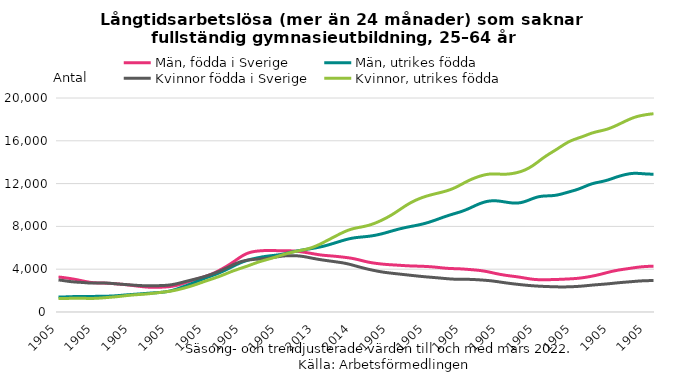
| Category | Män, födda i Sverige | Män, utrikes födda | Kvinnor födda i Sverige | Kvinnor, utrikes födda |
|---|---|---|---|---|
| 2006 | 3267.152 | 1395.05 | 2998.979 | 1259.358 |
| 2006-02 | 3238.533 | 1401.721 | 2961.518 | 1262.43 |
| 2006-03 | 3202.099 | 1409.549 | 2918.744 | 1265.991 |
| 2006-04 | 3160.918 | 1419.148 | 2876.447 | 1270.606 |
| 2006-05 | 3116.667 | 1430.543 | 2839.664 | 1276.511 |
| 2006-06 | 3068.672 | 1442.481 | 2811.801 | 1282.691 |
| 2006-07 | 3015.595 | 1452.34 | 2791.806 | 1286.376 |
| 2006-08 | 2956.97 | 1458.276 | 2775.028 | 1285.47 |
| 2006-09 | 2895.355 | 1460.155 | 2755.404 | 1280.343 |
| 2006-10 | 2835.872 | 1458.864 | 2732.393 | 1273.265 |
| 2006-11 | 2785.518 | 1457.084 | 2711.707 | 1268.029 |
| 2006-12 | 2749.116 | 1457.406 | 2699.819 | 1268.317 |
| 2007 | 2727.282 | 1460.265 | 2698.838 | 1276.295 |
| 2007-02 | 2715.151 | 1464.189 | 2703.954 | 1291.378 |
| 2007-03 | 2707.458 | 1468.663 | 2708.224 | 1311.257 |
| 2007-04 | 2699.46 | 1473.386 | 2707.236 | 1333.669 |
| 2007-05 | 2687.378 | 1479.134 | 2697.577 | 1356.168 |
| 2007-06 | 2669.793 | 1488.168 | 2678.893 | 1378.967 |
| 2007-07 | 2648.442 | 1502.323 | 2654.727 | 1403.532 |
| 2007-08 | 2626.429 | 1522.04 | 2629.486 | 1431.236 |
| 2007-09 | 2603.976 | 1546.046 | 2605.937 | 1462.244 |
| 2007-10 | 2579.192 | 1571.668 | 2585.157 | 1495.196 |
| 2007-11 | 2550.428 | 1596.424 | 2564.778 | 1528.171 |
| 2007-12 | 2518.201 | 1619.054 | 2543.224 | 1559.025 |
| 2008 | 2484.063 | 1639.885 | 2521.066 | 1586.095 |
| 2008-02 | 2449.58 | 1659.923 | 2499.508 | 1608.815 |
| 2008-03 | 2414.611 | 1680.42 | 2481.104 | 1628.391 |
| 2008-04 | 2380.12 | 1701.778 | 2467.095 | 1647.396 |
| 2008-05 | 2350.188 | 1724.357 | 2458.128 | 1668.758 |
| 2008-06 | 2327.929 | 1747.524 | 2454.654 | 1693.602 |
| 2008-07 | 2313.251 | 1769.451 | 2454.614 | 1721.983 |
| 2008-08 | 2306.055 | 1789.048 | 2456.511 | 1753.54 |
| 2008-09 | 2306.629 | 1807.221 | 2460.11 | 1786.68 |
| 2008-10 | 2314.102 | 1827.067 | 2465.609 | 1820.243 |
| 2008-11 | 2327.049 | 1853.247 | 2475.196 | 1853.946 |
| 2008-12 | 2344.817 | 1890.383 | 2491.653 | 1888.849 |
| 2009 | 2369.305 | 1942.43 | 2517.891 | 1927.596 |
| 2009-02 | 2405.437 | 2011.544 | 2557.313 | 1973.613 |
| 2009-03 | 2458.176 | 2096.198 | 2610.261 | 2028.466 |
| 2009-04 | 2527.849 | 2192.393 | 2673.635 | 2091.707 |
| 2009-05 | 2610.751 | 2294.817 | 2745.027 | 2161.9 |
| 2009-06 | 2703.311 | 2399.37 | 2820.815 | 2238.196 |
| 2009-07 | 2800.537 | 2505.61 | 2896.277 | 2319.129 |
| 2009-08 | 2897.171 | 2614.769 | 2968.34 | 2403.875 |
| 2009-09 | 2990.088 | 2727.336 | 3038.152 | 2493.905 |
| 2009-10 | 3078.747 | 2842.883 | 3108.571 | 2590.147 |
| 2009-11 | 3164.152 | 2958.663 | 3181.782 | 2690.52 |
| 2009-12 | 3250.122 | 3072.349 | 3260.789 | 2792.735 |
| 2010 | 3341.085 | 3182.2 | 3346.281 | 2893.702 |
| 2010-02 | 3441.548 | 3287.578 | 3438.062 | 2991.125 |
| 2010-03 | 3555.445 | 3390.654 | 3536.751 | 3086.309 |
| 2010-04 | 3684.339 | 3496.005 | 3642.776 | 3182.128 |
| 2010-05 | 3827.148 | 3607.926 | 3755.798 | 3282.014 |
| 2010-06 | 3979.614 | 3729.33 | 3876.313 | 3388.664 |
| 2010-07 | 4139.958 | 3859.644 | 4006.298 | 3501.923 |
| 2010-08 | 4309.221 | 3997.139 | 4144.672 | 3619.057 |
| 2010-09 | 4488.462 | 4139.889 | 4285.974 | 3734.176 |
| 2010-10 | 4679.093 | 4284.17 | 4422.928 | 3842.738 |
| 2010-11 | 4878.296 | 4424.717 | 4549.528 | 3944.655 |
| 2010-12 | 5075.755 | 4556.033 | 4658.99 | 4041.481 |
| 2011 | 5256.992 | 4673.441 | 4747.058 | 4136.688 |
| 2011-02 | 5409.314 | 4775.966 | 4814.309 | 4234.202 |
| 2011-03 | 5525.337 | 4864.432 | 4862.685 | 4336.139 |
| 2011-04 | 5606.609 | 4940.696 | 4896.505 | 4441.7 |
| 2011-05 | 5660.545 | 5008.15 | 4920.52 | 4547.314 |
| 2011-06 | 5696.104 | 5069.255 | 4938.616 | 4646.707 |
| 2011-07 | 5721.16 | 5125.068 | 4955.793 | 4737.974 |
| 2011-08 | 5738.535 | 5174.851 | 4977.483 | 4822.301 |
| 2011-09 | 5748.783 | 5216.939 | 5007.646 | 4903.725 |
| 2011-10 | 5750.606 | 5251.632 | 5047.088 | 4985.593 |
| 2011-11 | 5744.88 | 5283.245 | 5093.263 | 5070.032 |
| 2011-12 | 5735.992 | 5316.065 | 5140.913 | 5157.844 |
| 2012 | 5728.743 | 5354.878 | 5185.977 | 5247.933 |
| 2012-02 | 5725.171 | 5403.317 | 5223.258 | 5337.72 |
| 2012-03 | 5723.586 | 5461.634 | 5249.582 | 5423.36 |
| 2012-04 | 5720.491 | 5527.678 | 5264.612 | 5502.196 |
| 2012-05 | 5711.03 | 5595.55 | 5268.477 | 5574.421 |
| 2012-06 | 5692.63 | 5659.769 | 5261.939 | 5640.772 |
| 2012-07 | 5665.467 | 5718.172 | 5245.205 | 5702.095 |
| 2012-08 | 5630.643 | 5770.137 | 5217.258 | 5759.466 |
| 2012-09 | 5589.933 | 5816.82 | 5177.405 | 5817.855 |
| 2012-10 | 5544.816 | 5861.132 | 5127.372 | 5884.493 |
| 2012-11 | 5496.148 | 5905.244 | 5071.068 | 5964.87 |
| 2012-12 | 5445.293 | 5951.322 | 5013.727 | 6061.265 |
| 2013 | 5395.89 | 6002.324 | 4959.643 | 6175.083 |
| 2013-02 | 5351.395 | 6058.977 | 4910.071 | 6304.395 |
| 2013-03 | 5314.058 | 6122.508 | 4865.393 | 6445.298 |
| 2013-04 | 5284.383 | 6193.412 | 4824.045 | 6593.017 |
| 2013-05 | 5260.568 | 6271.793 | 4784.686 | 6742.142 |
| 2013-06 | 5238.493 | 6356.291 | 4745.649 | 6891.489 |
| 2013-07 | 5213.851 | 6444.037 | 4706.129 | 7040.516 |
| 2013-08 | 5185.631 | 6533.201 | 4666.047 | 7189.072 |
| 2013-09 | 5154.726 | 6621.843 | 4623.951 | 7333.446 |
| 2013-10 | 5121.996 | 6707.153 | 4576.24 | 7468.911 |
| 2013-11 | 5086.826 | 6785.368 | 4518.647 | 7591.325 |
| 2013-12 | 5046.383 | 6853.792 | 4450.698 | 7696.41 |
| 2014 | 4996.886 | 6909.451 | 4374.421 | 7781.475 |
| 2014-02 | 4937.124 | 6952.313 | 4294.298 | 7848.731 |
| 2014-03 | 4869.377 | 6985.488 | 4214.623 | 7905.719 |
| 2014-04 | 4797.499 | 7013.237 | 4138.053 | 7960.844 |
| 2014-05 | 4727.187 | 7040.777 | 4066.218 | 8021.436 |
| 2014-06 | 4664.368 | 7072.353 | 3999.25 | 8093.246 |
| 2014-07 | 4611.305 | 7111.368 | 3935.795 | 8179.539 |
| 2014-08 | 4566.978 | 7158.357 | 3874.805 | 8281.806 |
| 2014-09 | 4529.449 | 7214.666 | 3817.587 | 8398.93 |
| 2014-10 | 4496.013 | 7279.942 | 3765.905 | 8527.694 |
| 2014-11 | 4465.917 | 7352.591 | 3720.534 | 8664.769 |
| 2014-12 | 4440.736 | 7431.328 | 3681.366 | 8811.989 |
| 2015 | 4420.434 | 7513.481 | 3646.163 | 8971.045 |
| 2015-02 | 4403.421 | 7595.758 | 3613.639 | 9141.743 |
| 2015-03 | 4386.866 | 7675.856 | 3582.065 | 9323.695 |
| 2015-04 | 4368.987 | 7751.761 | 3550.462 | 9513.892 |
| 2015-05 | 4350.437 | 7821.828 | 3518.595 | 9707.946 |
| 2015-06 | 4332.464 | 7886.281 | 3487.255 | 9897.458 |
| 2015-07 | 4316.534 | 7945.562 | 3456.089 | 10075.117 |
| 2015-08 | 4303.944 | 8001.821 | 3425.153 | 10236.863 |
| 2015-09 | 4294.43 | 8057.519 | 3394.111 | 10381.898 |
| 2015-10 | 4286.778 | 8114.616 | 3363.255 | 10512.883 |
| 2015-11 | 4278.623 | 8176.465 | 3333.795 | 10631.165 |
| 2015-12 | 4267.475 | 8244.843 | 3306.129 | 10735.941 |
| 2016 | 4253.23 | 8321.622 | 3280.661 | 10828.263 |
| 2016-02 | 4235.823 | 8408.697 | 3256.912 | 10911.864 |
| 2016-03 | 4214.707 | 8503.834 | 3233.249 | 10988.149 |
| 2016-04 | 4189.114 | 8603.9 | 3208.967 | 11059.45 |
| 2016-05 | 4159.118 | 8707.372 | 3183.347 | 11128.973 |
| 2016-06 | 4127.805 | 8810.928 | 3156.634 | 11200.21 |
| 2016-07 | 4099.706 | 8911.786 | 3130.252 | 11277.801 |
| 2016-08 | 4077.869 | 9008.685 | 3105.71 | 11365.079 |
| 2016-09 | 4062.288 | 9099.293 | 3084.554 | 11466.951 |
| 2016-10 | 4051.881 | 9185.451 | 3069.426 | 11586.1 |
| 2016-11 | 4043.12 | 9270.284 | 3061.023 | 11721.669 |
| 2016-12 | 4031.618 | 9359.481 | 3057.966 | 11870.435 |
| 2017 | 4014.948 | 9458.463 | 3057.258 | 12024.436 |
| 2017-02 | 3993.821 | 9570.404 | 3055.339 | 12175.214 |
| 2017-03 | 3970.913 | 9694.553 | 3049.972 | 12315.789 |
| 2017-04 | 3947.362 | 9826.639 | 3039.909 | 12442.472 |
| 2017-05 | 3922.492 | 9959.128 | 3025.382 | 12554.672 |
| 2017-06 | 3893.409 | 10083.863 | 3007.922 | 12654.973 |
| 2017-07 | 3857.102 | 10193.696 | 2988.68 | 12743.522 |
| 2017-08 | 3812.203 | 10282.175 | 2967.778 | 12817.599 |
| 2017-09 | 3758.646 | 10346.002 | 2944.096 | 12871.089 |
| 2017-10 | 3697.807 | 10383.279 | 2915.32 | 12899.712 |
| 2017-11 | 3634.003 | 10394.82 | 2880.605 | 12906.256 |
| 2017-12 | 3572.656 | 10383.125 | 2841.377 | 12898.248 |
| 2018 | 3516.513 | 10352.789 | 2799.873 | 12885.061 |
| 2018-02 | 3466.57 | 10311.038 | 2757.809 | 12877.352 |
| 2018-03 | 3422.376 | 10264.975 | 2716.904 | 12882.273 |
| 2018-04 | 3383.385 | 10222.515 | 2678.42 | 12904.493 |
| 2018-05 | 3347.627 | 10190.136 | 2642.719 | 12943.241 |
| 2018-06 | 3311.405 | 10176.828 | 2609.06 | 12996.735 |
| 2018-07 | 3271.627 | 10192.587 | 2576.934 | 13066.572 |
| 2018-08 | 3226.529 | 10240.906 | 2546.072 | 13155 |
| 2018-09 | 3177.108 | 10319.006 | 2516.581 | 13265.932 |
| 2018-10 | 3127.871 | 10419.651 | 2489.283 | 13401.934 |
| 2018-11 | 3084.119 | 10531.376 | 2465.072 | 13563.974 |
| 2018-12 | 3049.826 | 10638.97 | 2443.486 | 13750.972 |
| 2019 | 3028.023 | 10730.29 | 2424.352 | 13957.814 |
| 2019-02 | 3017.587 | 10794.737 | 2408.284 | 14173.861 |
| 2019-03 | 3015.383 | 10831.5 | 2394.949 | 14386.645 |
| 2019-04 | 3017.911 | 10848.471 | 2383.243 | 14586.77 |
| 2019-05 | 3022.429 | 10858.457 | 2372.375 | 14772.161 |
| 2019-06 | 3028.651 | 10874.92 | 2362.169 | 14948.964 |
| 2019-07 | 3036.635 | 10906.171 | 2353.415 | 15125.083 |
| 2019-08 | 3046.345 | 10957.465 | 2347.025 | 15307.756 |
| 2019-09 | 3058.226 | 11027.597 | 2344.097 | 15495.483 |
| 2019-10 | 3071.425 | 11106.859 | 2345.074 | 15678.763 |
| 2019-11 | 3085.011 | 11186.989 | 2350.13 | 15846.363 |
| 2019-12 | 3099.802 | 11266.848 | 2358.803 | 15988.497 |
| 2020 | 3117.823 | 11348.766 | 2371.054 | 16106.612 |
| 2020-02 | 3140.808 | 11437.685 | 2386.357 | 16208.298 |
| 2020-03 | 3170.429 | 11539.75 | 2405.565 | 16305.692 |
| 2020-04 | 3206.535 | 11653.746 | 2428.959 | 16407.705 |
| 2020-05 | 3249.258 | 11773.287 | 2456.063 | 16516.802 |
| 2020-06 | 3297.773 | 11887.662 | 2484.639 | 16626.79 |
| 2020-07 | 3351.225 | 11984.984 | 2512.158 | 16726.801 |
| 2020-08 | 3410.076 | 12061.078 | 2537.326 | 16810.402 |
| 2020-09 | 3474.684 | 12122.528 | 2560.364 | 16880.026 |
| 2020-10 | 3544.884 | 12181.471 | 2582.312 | 16944.917 |
| 2020-11 | 3619.305 | 12247.848 | 2604.879 | 17014.632 |
| 2020-12 | 3694.585 | 12327.141 | 2629.946 | 17099.026 |
| 2021 | 3765.623 | 12418.708 | 2657.919 | 17200.654 |
| 2021-02 | 3830.222 | 12517.922 | 2687.891 | 17317.913 |
| 2021-03 | 3887.433 | 12615.674 | 2717.569 | 17447.188 |
| 2021-04 | 3937.776 | 12705.134 | 2745.103 | 17582.826 |
| 2021-05 | 3982.661 | 12784.586 | 2769.918 | 17720.938 |
| 2021-06 | 4024.359 | 12852.617 | 2792.898 | 17857.343 |
| 2021-07 | 4065.741 | 12908.208 | 2816.013 | 17988.503 |
| 2021-08 | 4107.776 | 12946.815 | 2840.087 | 18108.205 |
| 2021-09 | 4149.405 | 12961.783 | 2864.593 | 18211.147 |
| 2021-10 | 4186.966 | 12954.603 | 2887.129 | 18293.285 |
| 2021-11 | 4217.862 | 12935.618 | 2905.653 | 18358.345 |
| 2021-12 | 4241.716 | 12913.943 | 2919.278 | 18412.377 |
| 2022 | 4259.835 | 12896.421 | 2928.97 | 18459.5 |
| 2022-02 | 4273.247 | 12885.042 | 2935.981 | 18499.015 |
| 2022-03 | 4280.04 | 12876.449 | 2939.039 | 18526.332 |